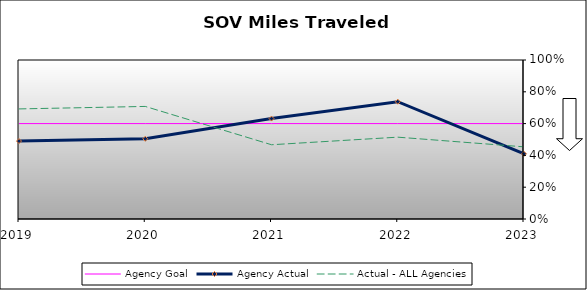
| Category | Agency Goal | Agency Actual | Actual - ALL Agencies |
|---|---|---|---|
| 2019.0 | 0.6 | 0.49 | 0.692 |
| 2020.0 | 0.6 | 0.505 | 0.708 |
| 2021.0 | 0.6 | 0.632 | 0.467 |
| 2022.0 | 0.6 | 0.738 | 0.515 |
| 2023.0 | 0.6 | 0.41 | 0.454 |